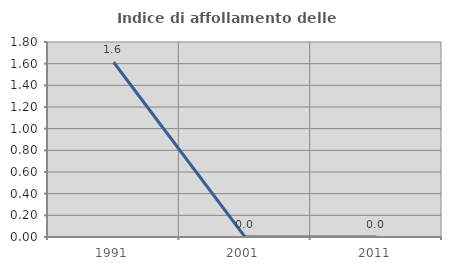
| Category | Indice di affollamento delle abitazioni  |
|---|---|
| 1991.0 | 1.613 |
| 2001.0 | 0 |
| 2011.0 | 0 |